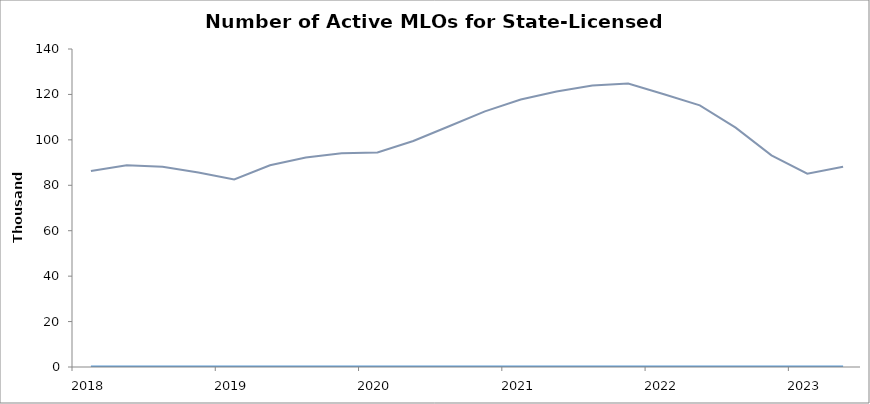
| Category | Quarter | Filing Quarter | Active MLOs |
|---|---|---|---|
| 2018 | 0 |  | 86269 |
| 2018 | 0 |  | 88855 |
| 2018 | 0 |  | 88147 |
| 2018 | 0 |  | 85647 |
| 2019 | 0 |  | 82551 |
| 2019 | 0 |  | 88832 |
| 2019 | 0 |  | 92248 |
| 2019 | 0 |  | 94126 |
| 2020 | 0 |  | 94419 |
| 2020 | 0 |  | 99501 |
| 2020 | 0 |  | 105994 |
| 2020 | 0 |  | 112559 |
| 2021 | 0 |  | 117789 |
| 2021 | 0 |  | 121245 |
| 2021 | 0 |  | 123942 |
| 2021 | 0 |  | 124761 |
| 2022 | 0 |  | 120083 |
| 2022 | 0 |  | 115193 |
| 2022 | 0 |  | 105367 |
| 2022 | 0 |  | 93200 |
| 2023 | 0 |  | 85138 |
| 2023 | 0 |  | 88131 |